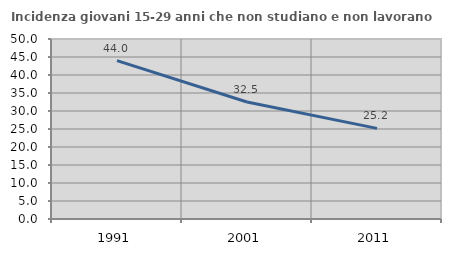
| Category | Incidenza giovani 15-29 anni che non studiano e non lavorano  |
|---|---|
| 1991.0 | 44 |
| 2001.0 | 32.5 |
| 2011.0 | 25.18 |